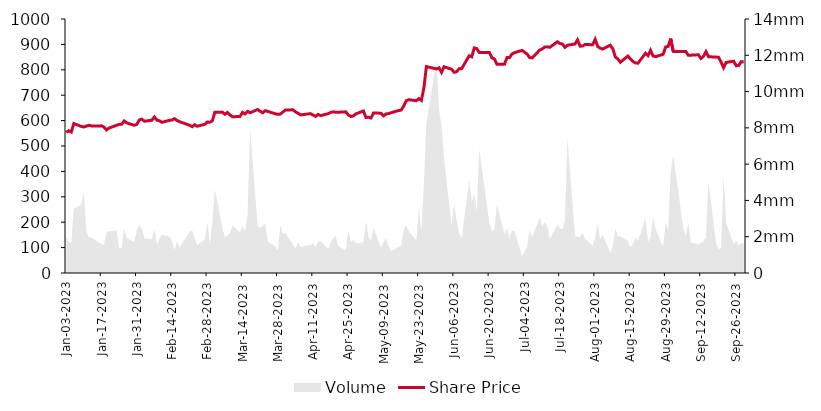
| Category | Share Price |
|---|---|
| 2023-01-03 | 553.48 |
| 2023-01-04 | 560.24 |
| 2023-01-05 | 555.02 |
| 2023-01-06 | 588.43 |
| 2023-01-09 | 576.89 |
| 2023-01-10 | 574.93 |
| 2023-01-11 | 578.14 |
| 2023-01-12 | 581.94 |
| 2023-01-13 | 579 |
| 2023-01-17 | 579.24 |
| 2023-01-18 | 574.29 |
| 2023-01-19 | 563.22 |
| 2023-01-20 | 570.78 |
| 2023-01-23 | 581.63 |
| 2023-01-24 | 585.03 |
| 2023-01-25 | 585.68 |
| 2023-01-26 | 598.58 |
| 2023-01-27 | 590.99 |
| 2023-01-30 | 581.45 |
| 2023-01-31 | 585.01 |
| 2023-02-01 | 602.75 |
| 2023-02-02 | 605.77 |
| 2023-02-03 | 597.62 |
| 2023-02-06 | 601.3 |
| 2023-02-07 | 614.45 |
| 2023-02-08 | 601.71 |
| 2023-02-09 | 599.41 |
| 2023-02-10 | 593.25 |
| 2023-02-13 | 601.12 |
| 2023-02-14 | 602.31 |
| 2023-02-15 | 607.69 |
| 2023-02-16 | 600.54 |
| 2023-02-17 | 595.59 |
| 2023-02-21 | 581.54 |
| 2023-02-22 | 576.17 |
| 2023-02-23 | 583.8 |
| 2023-02-24 | 577.75 |
| 2023-02-27 | 585.45 |
| 2023-02-28 | 594.29 |
| 2023-03-01 | 593.57 |
| 2023-03-02 | 598.65 |
| 2023-03-03 | 632.76 |
| 2023-03-06 | 632.92 |
| 2023-03-07 | 625.15 |
| 2023-03-08 | 632.26 |
| 2023-03-09 | 622.52 |
| 2023-03-10 | 614.83 |
| 2023-03-13 | 616.47 |
| 2023-03-14 | 632.46 |
| 2023-03-15 | 626.04 |
| 2023-03-16 | 636.5 |
| 2023-03-17 | 630.97 |
| 2023-03-20 | 643.71 |
| 2023-03-21 | 636.75 |
| 2023-03-22 | 630.92 |
| 2023-03-23 | 639.23 |
| 2023-03-24 | 636.17 |
| 2023-03-27 | 626.84 |
| 2023-03-28 | 624.7 |
| 2023-03-29 | 625.5 |
| 2023-03-30 | 633.75 |
| 2023-03-31 | 641.54 |
| 2023-04-03 | 642.47 |
| 2023-04-04 | 634.41 |
| 2023-04-05 | 629.01 |
| 2023-04-06 | 622.64 |
| 2023-04-10 | 627.39 |
| 2023-04-11 | 621.57 |
| 2023-04-12 | 616.7 |
| 2023-04-13 | 624.24 |
| 2023-04-14 | 619.54 |
| 2023-04-17 | 627.36 |
| 2023-04-18 | 632.32 |
| 2023-04-19 | 634.5 |
| 2023-04-20 | 633.02 |
| 2023-04-21 | 632.9 |
| 2023-04-24 | 634.54 |
| 2023-04-25 | 622.02 |
| 2023-04-26 | 616.19 |
| 2023-04-27 | 618.41 |
| 2023-04-28 | 626.5 |
| 2023-05-01 | 637.95 |
| 2023-05-02 | 612.34 |
| 2023-05-03 | 613.2 |
| 2023-05-04 | 610.16 |
| 2023-05-05 | 630.12 |
| 2023-05-08 | 629.06 |
| 2023-05-09 | 618.51 |
| 2023-05-10 | 626.27 |
| 2023-05-11 | 627.67 |
| 2023-05-12 | 631.15 |
| 2023-05-15 | 639.8 |
| 2023-05-16 | 641.44 |
| 2023-05-17 | 657.47 |
| 2023-05-18 | 677.9 |
| 2023-05-19 | 682.25 |
| 2023-05-22 | 678.37 |
| 2023-05-23 | 686.5 |
| 2023-05-24 | 679.53 |
| 2023-05-25 | 728.8 |
| 2023-05-26 | 812.73 |
| 2023-05-30 | 803.34 |
| 2023-05-31 | 807.96 |
| 2023-06-01 | 789.95 |
| 2023-06-02 | 812 |
| 2023-06-05 | 802.3 |
| 2023-06-06 | 790 |
| 2023-06-07 | 792.63 |
| 2023-06-08 | 804.2 |
| 2023-06-09 | 804.62 |
| 2023-06-12 | 855.36 |
| 2023-06-13 | 851.12 |
| 2023-06-14 | 886.18 |
| 2023-06-15 | 883.43 |
| 2023-06-16 | 868.11 |
| 2023-06-20 | 868.03 |
| 2023-06-21 | 847.66 |
| 2023-06-22 | 842.43 |
| 2023-06-23 | 822.15 |
| 2023-06-26 | 821.63 |
| 2023-06-27 | 848.4 |
| 2023-06-28 | 847.94 |
| 2023-06-29 | 862.57 |
| 2023-06-30 | 867.43 |
| 2023-07-03 | 876.44 |
| 2023-07-05 | 861.86 |
| 2023-07-06 | 848 |
| 2023-07-07 | 846.75 |
| 2023-07-10 | 877.73 |
| 2023-07-11 | 882.05 |
| 2023-07-12 | 889.95 |
| 2023-07-13 | 890.36 |
| 2023-07-14 | 888.58 |
| 2023-07-17 | 910.35 |
| 2023-07-18 | 903.43 |
| 2023-07-19 | 901.37 |
| 2023-07-20 | 888.34 |
| 2023-07-21 | 896.75 |
| 2023-07-24 | 901.59 |
| 2023-07-25 | 917.99 |
| 2023-07-26 | 893.09 |
| 2023-07-27 | 893.53 |
| 2023-07-28 | 899.79 |
| 2023-07-31 | 898.65 |
| 2023-08-01 | 920 |
| 2023-08-02 | 892.3 |
| 2023-08-03 | 884.98 |
| 2023-08-04 | 881.65 |
| 2023-08-07 | 897.06 |
| 2023-08-08 | 883.16 |
| 2023-08-09 | 850.73 |
| 2023-08-10 | 842.9 |
| 2023-08-11 | 829.76 |
| 2023-08-14 | 854.1 |
| 2023-08-15 | 842.52 |
| 2023-08-16 | 832.99 |
| 2023-08-17 | 827.1 |
| 2023-08-18 | 825.84 |
| 2023-08-21 | 865.14 |
| 2023-08-22 | 855.79 |
| 2023-08-23 | 876.58 |
| 2023-08-24 | 854.46 |
| 2023-08-25 | 851.82 |
| 2023-08-28 | 861.08 |
| 2023-08-29 | 889.93 |
| 2023-08-30 | 892.28 |
| 2023-08-31 | 922.89 |
| 2023-09-01 | 872.52 |
| 2023-09-05 | 872.17 |
| 2023-09-06 | 872.27 |
| 2023-09-07 | 857.03 |
| 2023-09-08 | 857.55 |
| 2023-09-11 | 859.14 |
| 2023-09-12 | 844.52 |
| 2023-09-13 | 852.93 |
| 2023-09-14 | 871.64 |
| 2023-09-15 | 851.68 |
| 2023-09-18 | 850 |
| 2023-09-19 | 849.2 |
| 2023-09-20 | 830.57 |
| 2023-09-21 | 808.36 |
| 2023-09-22 | 829.08 |
| 2023-09-25 | 833.89 |
| 2023-09-26 | 816.19 |
| 2023-09-27 | 816.81 |
| 2023-09-28 | 832 |
| 2023-09-29 | 830.58 |